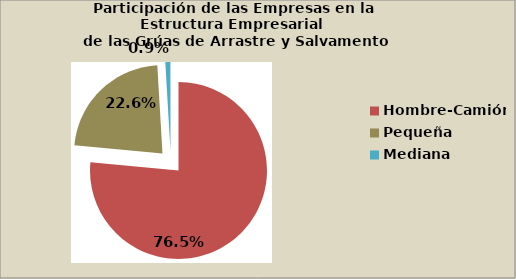
| Category | Series 0 |
|---|---|
| Hombre-Camión | 76.541 |
| Pequeña | 22.573 |
| Mediana | 0.9 |
| Grande | 0.039 |